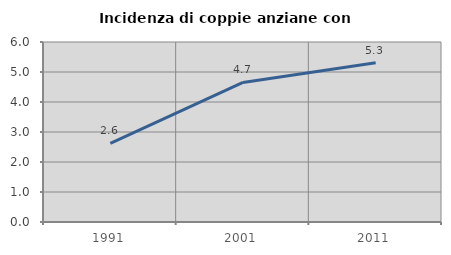
| Category | Incidenza di coppie anziane con figli |
|---|---|
| 1991.0 | 2.622 |
| 2001.0 | 4.652 |
| 2011.0 | 5.305 |